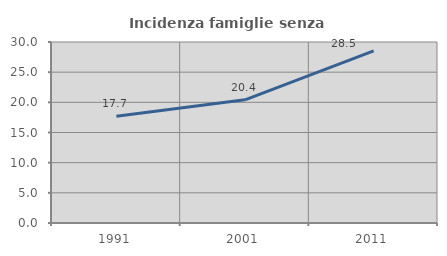
| Category | Incidenza famiglie senza nuclei |
|---|---|
| 1991.0 | 17.706 |
| 2001.0 | 20.413 |
| 2011.0 | 28.533 |